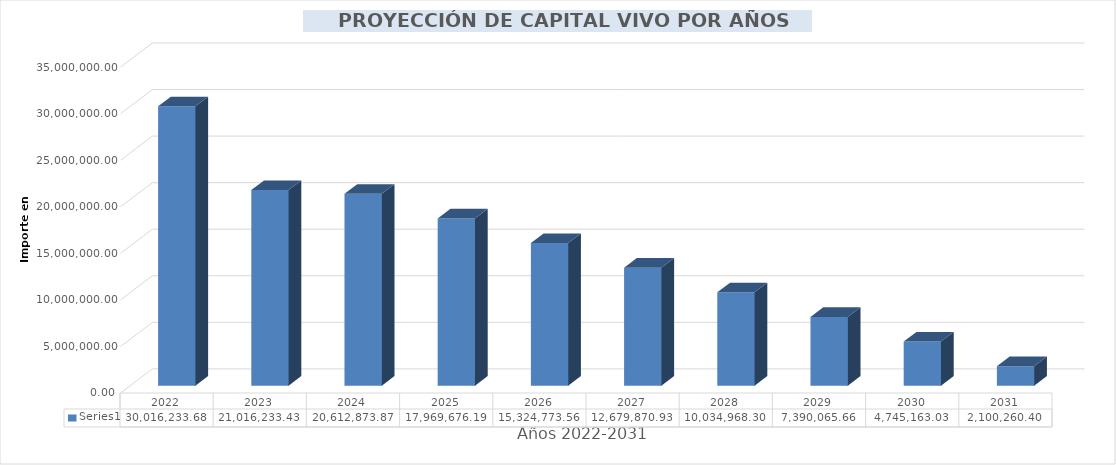
| Category | Series 0 |
|---|---|
| 2022.0 | 30016233.68 |
| 2023.0 | 21016233.43 |
| 2024.0 | 20612873.868 |
| 2025.0 | 17969676.194 |
| 2026.0 | 15324773.561 |
| 2027.0 | 12679870.929 |
| 2028.0 | 10034968.296 |
| 2029.0 | 7390065.664 |
| 2030.0 | 4745163.031 |
| 2031.0 | 2100260.399 |